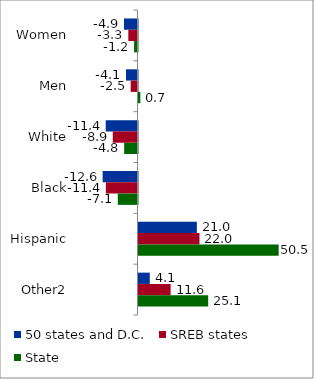
| Category | 50 states and D.C. | SREB states | State |
|---|---|---|---|
| Women | -4.867 | -3.311 | -1.229 |
| Men | -4.148 | -2.459 | 0.664 |
| White | -11.449 | -8.905 | -4.8 |
| Black | -12.565 | -11.407 | -7.099 |
| Hispanic | 21.032 | 21.968 | 50.507 |
| Other2 | 4.06 | 11.58 | 25.109 |